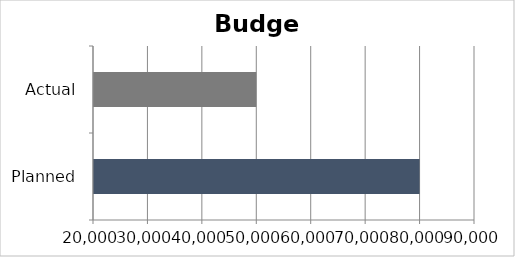
| Category | Series 0 |
|---|---|
| Planned | 80000 |
| Actual | 50000 |